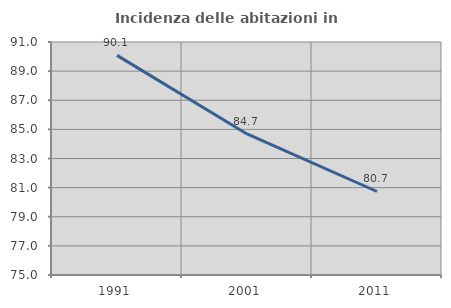
| Category | Incidenza delle abitazioni in proprietà  |
|---|---|
| 1991.0 | 90.083 |
| 2001.0 | 84.685 |
| 2011.0 | 80.734 |